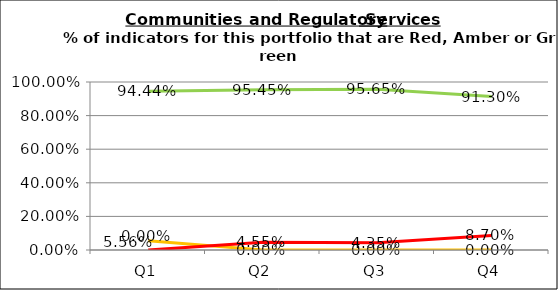
| Category | Green | Amber | Red |
|---|---|---|---|
| Q1 | 0.944 | 0.056 | 0 |
| Q2 | 0.955 | 0 | 0.045 |
| Q3 | 0.957 | 0 | 0.043 |
| Q4 | 0.913 | 0 | 0.087 |